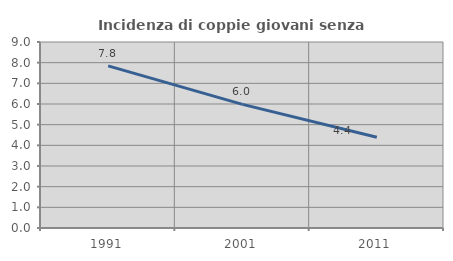
| Category | Incidenza di coppie giovani senza figli |
|---|---|
| 1991.0 | 7.843 |
| 2001.0 | 5.982 |
| 2011.0 | 4.388 |